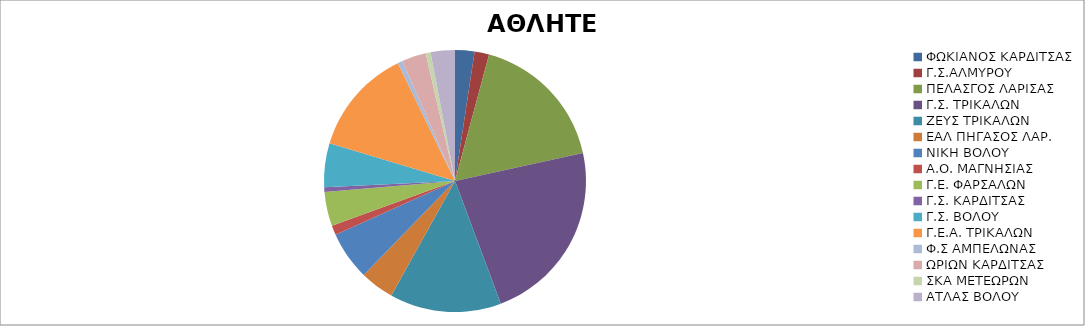
| Category | ΑΘΛΗΤΕΣ |
|---|---|
| ΦΩΚΙΑΝΟΣ ΚΑΡΔΙΤΣΑΣ | 4 |
| Γ.Σ.ΑΛΜΥΡΟΥ | 3 |
| ΠΕΛΑΣΓΟΣ ΛΑΡΙΣΑΣ | 29 |
| Γ.Σ. ΤΡΙΚΑΛΩΝ | 38 |
| ΖΕΥΣ ΤΡΙΚΑΛΩΝ | 23 |
| ΕΑΛ ΠΗΓΑΣΟΣ ΛΑΡ. | 7 |
| ΝΙΚΗ ΒΟΛΟΥ | 10 |
| Α.Ο. ΜΑΓΝΗΣΙΑΣ | 2 |
| Γ.Ε. ΦΑΡΣΑΛΩΝ | 7 |
| Γ.Σ. ΚΑΡΔΙΤΣΑΣ | 1 |
| Γ.Σ. ΒΟΛΟΥ | 9 |
| Γ.Ε.Α. ΤΡΙΚΑΛΩΝ | 22 |
| Φ.Σ ΑΜΠΕΛΩΝΑΣ | 1 |
| ΩΡΙΩΝ ΚΑΡΔΙΤΣΑΣ | 5 |
| ΣΚΑ ΜΕΤΕΩΡΩΝ | 1 |
| ΑΤΛΑΣ ΒΟΛΟΥ | 5 |